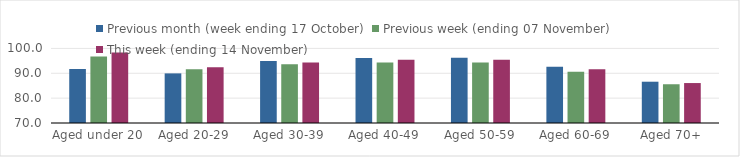
| Category | Previous month (week ending 17 October) | Previous week (ending 07 November) | This week (ending 14 November) |
|---|---|---|---|
| Aged under 20 | 91.68 | 96.75 | 98.37 |
| Aged 20-29 | 89.96 | 91.67 | 92.43 |
| Aged 30-39 | 94.9 | 93.6 | 94.38 |
| Aged 40-49 | 96.19 | 94.37 | 95.44 |
| Aged 50-59 | 96.23 | 94.31 | 95.45 |
| Aged 60-69 | 92.64 | 90.62 | 91.67 |
| Aged 70+ | 86.61 | 85.59 | 86.07 |